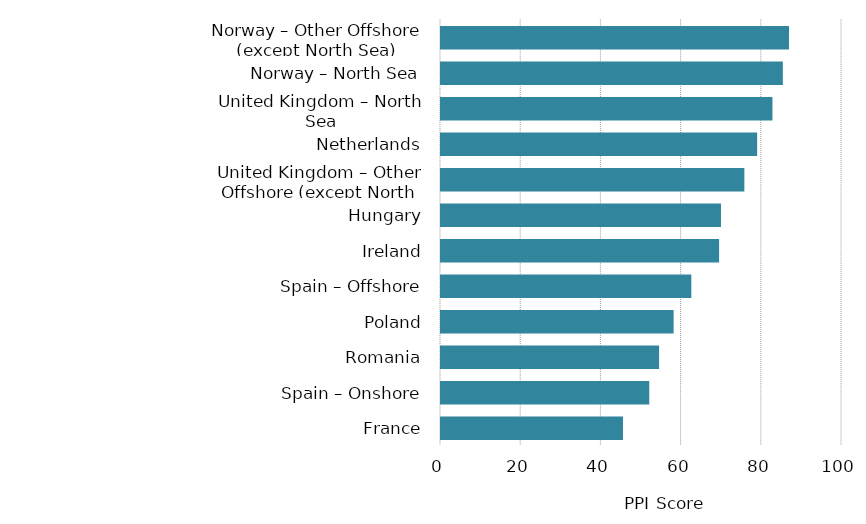
| Category | PPI Score |
|---|---|
| France | 45.636 |
| Spain – Onshore | 52.184 |
| Romania | 54.639 |
| Poland | 58.261 |
| Spain – Offshore | 62.67 |
| Ireland | 69.601 |
| Hungary | 70.07 |
| United Kingdom – Other Offshore (except North Sea) | 75.899 |
| Netherlands | 79.09 |
| United Kingdom – North Sea | 82.904 |
| Norway – North Sea | 85.495 |
| Norway – Other Offshore (except North Sea) | 87.028 |